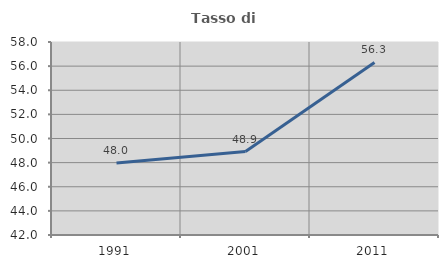
| Category | Tasso di occupazione   |
|---|---|
| 1991.0 | 47.964 |
| 2001.0 | 48.915 |
| 2011.0 | 56.309 |